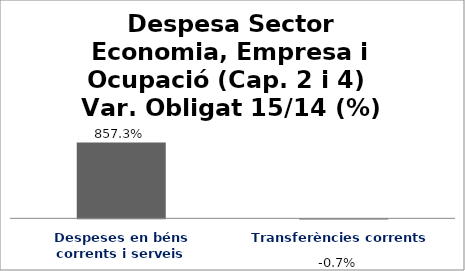
| Category | Series 0 |
|---|---|
| Despeses en béns corrents i serveis | 8.573 |
| Transferències corrents | -0.007 |